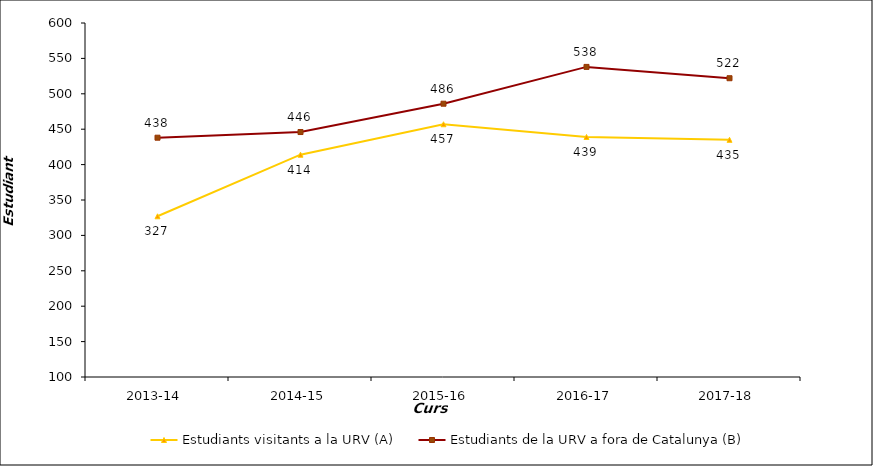
| Category | Estudiants visitants a la URV (A) | Estudiants de la URV a fora de Catalunya (B) |
|---|---|---|
| 2013-14 | 327 | 438 |
| 2014-15 | 414 | 446 |
| 2015-16 | 457 | 486 |
| 2016-17 | 439 | 538 |
| 2017-18 | 435 | 522 |